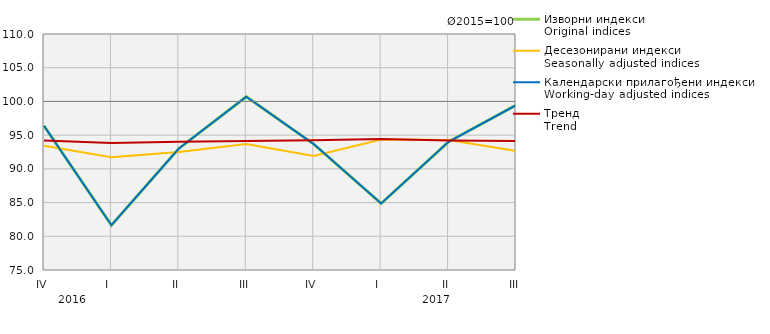
| Category | Изворни индекси
Original indices | Десезонирани индекси
Seasonally adjusted indices | Календарски прилагођени индекси
Working-day adjusted indices | Тренд
Trend |
|---|---|---|---|---|
| IV | 96.374 | 93.442 | 96.374 | 94.2 |
| I  | 81.644 | 91.71 | 81.644 | 93.816 |
| II | 93.009 | 92.518 | 93.009 | 94.018 |
| III | 100.703 | 93.684 | 100.703 | 94.137 |
| IV | 93.669 | 91.911 | 93.669 | 94.257 |
| I  | 84.864 | 94.346 | 84.864 | 94.434 |
| II | 94.016 | 94.271 | 94.016 | 94.209 |
| III | 99.439 | 92.667 | 99.439 | 94.112 |